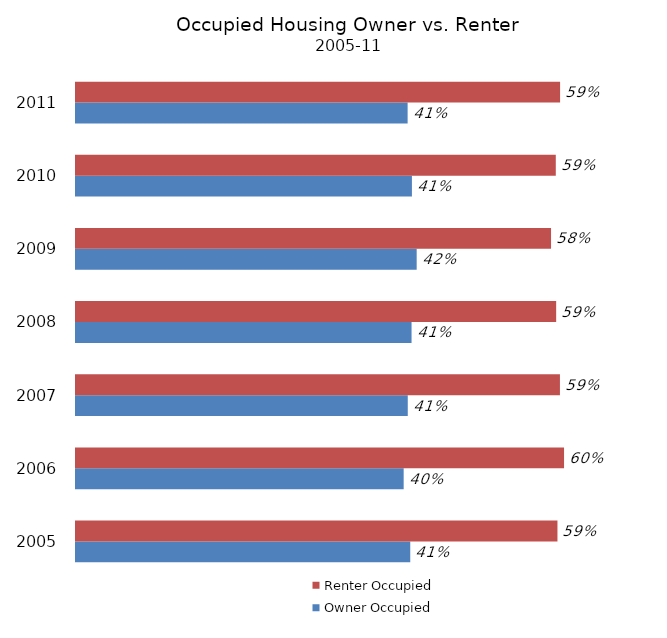
| Category | Owner Occupied | Renter Occupied |
|---|---|---|
| 2005 | 0.41 | 0.59 |
| 2006 | 0.402 | 0.598 |
| 2007 | 0.407 | 0.593 |
| 2008 | 0.411 | 0.589 |
| 2009 | 0.418 | 0.582 |
| 2010 | 0.412 | 0.588 |
| 2011 | 0.407 | 0.593 |